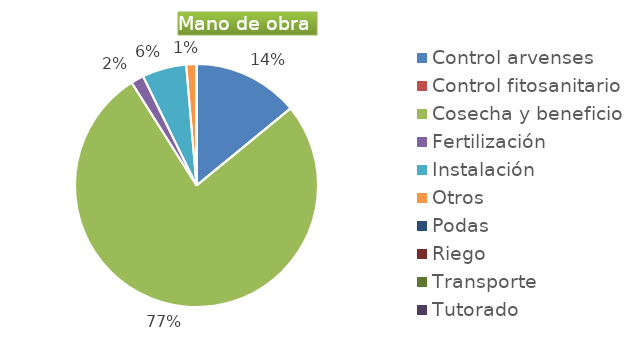
| Category | Series 0 |
|---|---|
| Control arvenses | 11090970 |
| Control fitosanitario | 0 |
| Cosecha y beneficio | 60676000 |
| Fertilización | 1344360 |
| Instalación | 4638042 |
| Otros | 1075488 |
| Podas | 0 |
| Riego | 0 |
| Transporte | 0 |
| Tutorado | 0 |